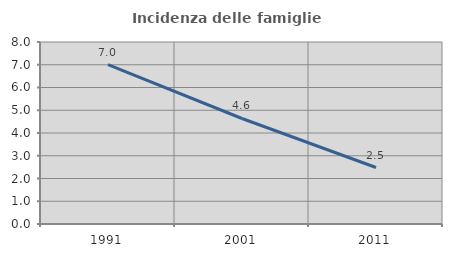
| Category | Incidenza delle famiglie numerose |
|---|---|
| 1991.0 | 7.006 |
| 2001.0 | 4.638 |
| 2011.0 | 2.483 |